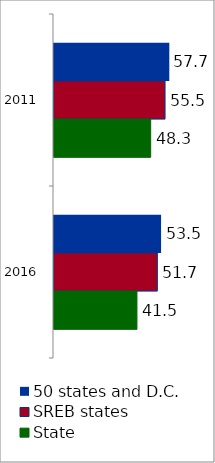
| Category | 50 states and D.C. | SREB states | State |
|---|---|---|---|
| 2011.0 | 57.656 | 55.525 | 48.341 |
| 2016.0 | 53.539 | 51.678 | 41.476 |